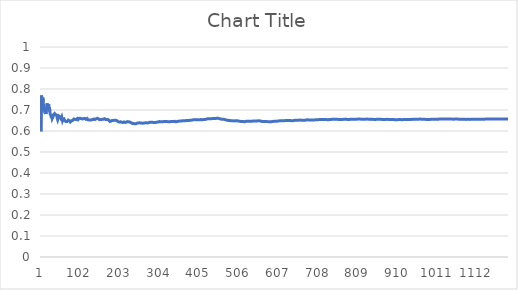
| Category | Series 0 |
|---|---|
| 0 | 0.597 |
| 1 | 0.769 |
| 2 | 0.72 |
| 3 | 0.7 |
| 4 | 0.758 |
| 5 | 0.738 |
| 6 | 0.738 |
| 7 | 0.707 |
| 8 | 0.706 |
| 9 | 0.711 |
| 10 | 0.684 |
| 11 | 0.692 |
| 12 | 0.681 |
| 13 | 0.701 |
| 14 | 0.717 |
| 15 | 0.731 |
| 16 | 0.719 |
| 17 | 0.711 |
| 18 | 0.722 |
| 19 | 0.727 |
| 20 | 0.702 |
| 21 | 0.713 |
| 22 | 0.692 |
| 23 | 0.681 |
| 24 | 0.685 |
| 25 | 0.671 |
| 26 | 0.662 |
| 27 | 0.67 |
| 28 | 0.659 |
| 29 | 0.66 |
| 30 | 0.667 |
| 31 | 0.676 |
| 32 | 0.674 |
| 33 | 0.675 |
| 34 | 0.683 |
| 35 | 0.683 |
| 36 | 0.678 |
| 37 | 0.677 |
| 38 | 0.678 |
| 39 | 0.676 |
| 40 | 0.667 |
| 41 | 0.665 |
| 42 | 0.654 |
| 43 | 0.658 |
| 44 | 0.665 |
| 45 | 0.671 |
| 46 | 0.673 |
| 47 | 0.673 |
| 48 | 0.667 |
| 49 | 0.666 |
| 50 | 0.66 |
| 51 | 0.663 |
| 52 | 0.668 |
| 53 | 0.659 |
| 54 | 0.651 |
| 55 | 0.656 |
| 56 | 0.653 |
| 57 | 0.654 |
| 58 | 0.658 |
| 59 | 0.657 |
| 60 | 0.648 |
| 61 | 0.648 |
| 62 | 0.648 |
| 63 | 0.646 |
| 64 | 0.644 |
| 65 | 0.644 |
| 66 | 0.645 |
| 67 | 0.644 |
| 68 | 0.648 |
| 69 | 0.652 |
| 70 | 0.657 |
| 71 | 0.653 |
| 72 | 0.648 |
| 73 | 0.645 |
| 74 | 0.643 |
| 75 | 0.645 |
| 76 | 0.645 |
| 77 | 0.649 |
| 78 | 0.65 |
| 79 | 0.647 |
| 80 | 0.65 |
| 81 | 0.649 |
| 82 | 0.653 |
| 83 | 0.657 |
| 84 | 0.653 |
| 85 | 0.655 |
| 86 | 0.655 |
| 87 | 0.656 |
| 88 | 0.653 |
| 89 | 0.654 |
| 90 | 0.657 |
| 91 | 0.657 |
| 92 | 0.659 |
| 93 | 0.66 |
| 94 | 0.655 |
| 95 | 0.656 |
| 96 | 0.66 |
| 97 | 0.663 |
| 98 | 0.663 |
| 99 | 0.661 |
| 100 | 0.661 |
| 101 | 0.658 |
| 102 | 0.659 |
| 103 | 0.658 |
| 104 | 0.66 |
| 105 | 0.657 |
| 106 | 0.657 |
| 107 | 0.659 |
| 108 | 0.659 |
| 109 | 0.662 |
| 110 | 0.659 |
| 111 | 0.66 |
| 112 | 0.659 |
| 113 | 0.66 |
| 114 | 0.656 |
| 115 | 0.657 |
| 116 | 0.657 |
| 117 | 0.659 |
| 118 | 0.656 |
| 119 | 0.653 |
| 120 | 0.656 |
| 121 | 0.657 |
| 122 | 0.653 |
| 123 | 0.653 |
| 124 | 0.652 |
| 125 | 0.652 |
| 126 | 0.654 |
| 127 | 0.652 |
| 128 | 0.653 |
| 129 | 0.654 |
| 130 | 0.654 |
| 131 | 0.654 |
| 132 | 0.655 |
| 133 | 0.656 |
| 134 | 0.657 |
| 135 | 0.659 |
| 136 | 0.658 |
| 137 | 0.655 |
| 138 | 0.654 |
| 139 | 0.656 |
| 140 | 0.658 |
| 141 | 0.66 |
| 142 | 0.659 |
| 143 | 0.66 |
| 144 | 0.659 |
| 145 | 0.656 |
| 146 | 0.657 |
| 147 | 0.656 |
| 148 | 0.653 |
| 149 | 0.654 |
| 150 | 0.652 |
| 151 | 0.654 |
| 152 | 0.655 |
| 153 | 0.656 |
| 154 | 0.657 |
| 155 | 0.656 |
| 156 | 0.656 |
| 157 | 0.657 |
| 158 | 0.656 |
| 159 | 0.657 |
| 160 | 0.657 |
| 161 | 0.659 |
| 162 | 0.656 |
| 163 | 0.655 |
| 164 | 0.655 |
| 165 | 0.655 |
| 166 | 0.653 |
| 167 | 0.654 |
| 168 | 0.654 |
| 169 | 0.655 |
| 170 | 0.654 |
| 171 | 0.652 |
| 172 | 0.651 |
| 173 | 0.65 |
| 174 | 0.648 |
| 175 | 0.645 |
| 176 | 0.647 |
| 177 | 0.646 |
| 178 | 0.647 |
| 179 | 0.647 |
| 180 | 0.649 |
| 181 | 0.65 |
| 182 | 0.652 |
| 183 | 0.652 |
| 184 | 0.65 |
| 185 | 0.65 |
| 186 | 0.651 |
| 187 | 0.652 |
| 188 | 0.653 |
| 189 | 0.653 |
| 190 | 0.651 |
| 191 | 0.649 |
| 192 | 0.65 |
| 193 | 0.648 |
| 194 | 0.648 |
| 195 | 0.645 |
| 196 | 0.644 |
| 197 | 0.644 |
| 198 | 0.643 |
| 199 | 0.642 |
| 200 | 0.643 |
| 201 | 0.643 |
| 202 | 0.644 |
| 203 | 0.642 |
| 204 | 0.643 |
| 205 | 0.642 |
| 206 | 0.643 |
| 207 | 0.643 |
| 208 | 0.641 |
| 209 | 0.641 |
| 210 | 0.643 |
| 211 | 0.643 |
| 212 | 0.641 |
| 213 | 0.642 |
| 214 | 0.641 |
| 215 | 0.64 |
| 216 | 0.641 |
| 217 | 0.643 |
| 218 | 0.644 |
| 219 | 0.644 |
| 220 | 0.645 |
| 221 | 0.644 |
| 222 | 0.645 |
| 223 | 0.644 |
| 224 | 0.644 |
| 225 | 0.643 |
| 226 | 0.642 |
| 227 | 0.642 |
| 228 | 0.64 |
| 229 | 0.639 |
| 230 | 0.637 |
| 231 | 0.638 |
| 232 | 0.636 |
| 233 | 0.635 |
| 234 | 0.635 |
| 235 | 0.636 |
| 236 | 0.636 |
| 237 | 0.637 |
| 238 | 0.634 |
| 239 | 0.634 |
| 240 | 0.633 |
| 241 | 0.634 |
| 242 | 0.635 |
| 243 | 0.636 |
| 244 | 0.637 |
| 245 | 0.638 |
| 246 | 0.638 |
| 247 | 0.638 |
| 248 | 0.637 |
| 249 | 0.639 |
| 250 | 0.639 |
| 251 | 0.638 |
| 252 | 0.638 |
| 253 | 0.638 |
| 254 | 0.637 |
| 255 | 0.638 |
| 256 | 0.638 |
| 257 | 0.638 |
| 258 | 0.637 |
| 259 | 0.637 |
| 260 | 0.637 |
| 261 | 0.637 |
| 262 | 0.638 |
| 263 | 0.639 |
| 264 | 0.639 |
| 265 | 0.639 |
| 266 | 0.638 |
| 267 | 0.639 |
| 268 | 0.639 |
| 269 | 0.638 |
| 270 | 0.637 |
| 271 | 0.638 |
| 272 | 0.638 |
| 273 | 0.639 |
| 274 | 0.64 |
| 275 | 0.641 |
| 276 | 0.642 |
| 277 | 0.642 |
| 278 | 0.643 |
| 279 | 0.642 |
| 280 | 0.642 |
| 281 | 0.642 |
| 282 | 0.643 |
| 283 | 0.641 |
| 284 | 0.641 |
| 285 | 0.64 |
| 286 | 0.641 |
| 287 | 0.641 |
| 288 | 0.641 |
| 289 | 0.64 |
| 290 | 0.641 |
| 291 | 0.641 |
| 292 | 0.641 |
| 293 | 0.642 |
| 294 | 0.642 |
| 295 | 0.643 |
| 296 | 0.644 |
| 297 | 0.643 |
| 298 | 0.643 |
| 299 | 0.644 |
| 300 | 0.644 |
| 301 | 0.645 |
| 302 | 0.644 |
| 303 | 0.644 |
| 304 | 0.644 |
| 305 | 0.643 |
| 306 | 0.644 |
| 307 | 0.645 |
| 308 | 0.644 |
| 309 | 0.644 |
| 310 | 0.644 |
| 311 | 0.645 |
| 312 | 0.645 |
| 313 | 0.646 |
| 314 | 0.646 |
| 315 | 0.645 |
| 316 | 0.645 |
| 317 | 0.645 |
| 318 | 0.646 |
| 319 | 0.646 |
| 320 | 0.645 |
| 321 | 0.645 |
| 322 | 0.644 |
| 323 | 0.644 |
| 324 | 0.643 |
| 325 | 0.644 |
| 326 | 0.645 |
| 327 | 0.645 |
| 328 | 0.644 |
| 329 | 0.644 |
| 330 | 0.645 |
| 331 | 0.645 |
| 332 | 0.646 |
| 333 | 0.645 |
| 334 | 0.645 |
| 335 | 0.645 |
| 336 | 0.646 |
| 337 | 0.645 |
| 338 | 0.646 |
| 339 | 0.646 |
| 340 | 0.646 |
| 341 | 0.646 |
| 342 | 0.645 |
| 343 | 0.644 |
| 344 | 0.644 |
| 345 | 0.644 |
| 346 | 0.645 |
| 347 | 0.645 |
| 348 | 0.646 |
| 349 | 0.647 |
| 350 | 0.647 |
| 351 | 0.646 |
| 352 | 0.647 |
| 353 | 0.647 |
| 354 | 0.648 |
| 355 | 0.648 |
| 356 | 0.648 |
| 357 | 0.648 |
| 358 | 0.648 |
| 359 | 0.648 |
| 360 | 0.649 |
| 361 | 0.649 |
| 362 | 0.65 |
| 363 | 0.65 |
| 364 | 0.648 |
| 365 | 0.649 |
| 366 | 0.649 |
| 367 | 0.649 |
| 368 | 0.65 |
| 369 | 0.65 |
| 370 | 0.65 |
| 371 | 0.65 |
| 372 | 0.65 |
| 373 | 0.65 |
| 374 | 0.651 |
| 375 | 0.65 |
| 376 | 0.65 |
| 377 | 0.651 |
| 378 | 0.651 |
| 379 | 0.652 |
| 380 | 0.651 |
| 381 | 0.651 |
| 382 | 0.651 |
| 383 | 0.652 |
| 384 | 0.652 |
| 385 | 0.653 |
| 386 | 0.653 |
| 387 | 0.653 |
| 388 | 0.654 |
| 389 | 0.653 |
| 390 | 0.653 |
| 391 | 0.654 |
| 392 | 0.654 |
| 393 | 0.654 |
| 394 | 0.654 |
| 395 | 0.653 |
| 396 | 0.653 |
| 397 | 0.653 |
| 398 | 0.652 |
| 399 | 0.653 |
| 400 | 0.653 |
| 401 | 0.652 |
| 402 | 0.653 |
| 403 | 0.653 |
| 404 | 0.654 |
| 405 | 0.654 |
| 406 | 0.655 |
| 407 | 0.654 |
| 408 | 0.654 |
| 409 | 0.653 |
| 410 | 0.654 |
| 411 | 0.654 |
| 412 | 0.654 |
| 413 | 0.654 |
| 414 | 0.654 |
| 415 | 0.655 |
| 416 | 0.655 |
| 417 | 0.655 |
| 418 | 0.655 |
| 419 | 0.656 |
| 420 | 0.656 |
| 421 | 0.657 |
| 422 | 0.657 |
| 423 | 0.658 |
| 424 | 0.659 |
| 425 | 0.658 |
| 426 | 0.658 |
| 427 | 0.659 |
| 428 | 0.659 |
| 429 | 0.658 |
| 430 | 0.658 |
| 431 | 0.658 |
| 432 | 0.659 |
| 433 | 0.659 |
| 434 | 0.659 |
| 435 | 0.659 |
| 436 | 0.659 |
| 437 | 0.658 |
| 438 | 0.659 |
| 439 | 0.659 |
| 440 | 0.659 |
| 441 | 0.66 |
| 442 | 0.66 |
| 443 | 0.661 |
| 444 | 0.661 |
| 445 | 0.66 |
| 446 | 0.66 |
| 447 | 0.661 |
| 448 | 0.661 |
| 449 | 0.661 |
| 450 | 0.66 |
| 451 | 0.66 |
| 452 | 0.66 |
| 453 | 0.659 |
| 454 | 0.658 |
| 455 | 0.658 |
| 456 | 0.658 |
| 457 | 0.657 |
| 458 | 0.658 |
| 459 | 0.657 |
| 460 | 0.656 |
| 461 | 0.655 |
| 462 | 0.656 |
| 463 | 0.656 |
| 464 | 0.656 |
| 465 | 0.656 |
| 466 | 0.655 |
| 467 | 0.654 |
| 468 | 0.654 |
| 469 | 0.654 |
| 470 | 0.653 |
| 471 | 0.652 |
| 472 | 0.652 |
| 473 | 0.652 |
| 474 | 0.652 |
| 475 | 0.651 |
| 476 | 0.65 |
| 477 | 0.649 |
| 478 | 0.65 |
| 479 | 0.65 |
| 480 | 0.65 |
| 481 | 0.65 |
| 482 | 0.65 |
| 483 | 0.65 |
| 484 | 0.649 |
| 485 | 0.65 |
| 486 | 0.65 |
| 487 | 0.649 |
| 488 | 0.648 |
| 489 | 0.648 |
| 490 | 0.648 |
| 491 | 0.647 |
| 492 | 0.648 |
| 493 | 0.648 |
| 494 | 0.649 |
| 495 | 0.648 |
| 496 | 0.648 |
| 497 | 0.649 |
| 498 | 0.649 |
| 499 | 0.649 |
| 500 | 0.648 |
| 501 | 0.648 |
| 502 | 0.647 |
| 503 | 0.647 |
| 504 | 0.647 |
| 505 | 0.646 |
| 506 | 0.647 |
| 507 | 0.646 |
| 508 | 0.645 |
| 509 | 0.646 |
| 510 | 0.645 |
| 511 | 0.645 |
| 512 | 0.646 |
| 513 | 0.646 |
| 514 | 0.645 |
| 515 | 0.645 |
| 516 | 0.644 |
| 517 | 0.644 |
| 518 | 0.644 |
| 519 | 0.645 |
| 520 | 0.645 |
| 521 | 0.645 |
| 522 | 0.646 |
| 523 | 0.646 |
| 524 | 0.646 |
| 525 | 0.646 |
| 526 | 0.646 |
| 527 | 0.646 |
| 528 | 0.647 |
| 529 | 0.647 |
| 530 | 0.646 |
| 531 | 0.646 |
| 532 | 0.646 |
| 533 | 0.646 |
| 534 | 0.647 |
| 535 | 0.646 |
| 536 | 0.646 |
| 537 | 0.647 |
| 538 | 0.647 |
| 539 | 0.647 |
| 540 | 0.647 |
| 541 | 0.647 |
| 542 | 0.647 |
| 543 | 0.647 |
| 544 | 0.648 |
| 545 | 0.647 |
| 546 | 0.648 |
| 547 | 0.648 |
| 548 | 0.647 |
| 549 | 0.648 |
| 550 | 0.648 |
| 551 | 0.648 |
| 552 | 0.648 |
| 553 | 0.648 |
| 554 | 0.648 |
| 555 | 0.648 |
| 556 | 0.648 |
| 557 | 0.648 |
| 558 | 0.647 |
| 559 | 0.647 |
| 560 | 0.647 |
| 561 | 0.646 |
| 562 | 0.645 |
| 563 | 0.646 |
| 564 | 0.646 |
| 565 | 0.645 |
| 566 | 0.645 |
| 567 | 0.645 |
| 568 | 0.645 |
| 569 | 0.645 |
| 570 | 0.645 |
| 571 | 0.645 |
| 572 | 0.645 |
| 573 | 0.645 |
| 574 | 0.645 |
| 575 | 0.644 |
| 576 | 0.644 |
| 577 | 0.644 |
| 578 | 0.644 |
| 579 | 0.644 |
| 580 | 0.644 |
| 581 | 0.644 |
| 582 | 0.644 |
| 583 | 0.644 |
| 584 | 0.644 |
| 585 | 0.645 |
| 586 | 0.645 |
| 587 | 0.645 |
| 588 | 0.645 |
| 589 | 0.646 |
| 590 | 0.645 |
| 591 | 0.646 |
| 592 | 0.646 |
| 593 | 0.647 |
| 594 | 0.646 |
| 595 | 0.646 |
| 596 | 0.646 |
| 597 | 0.646 |
| 598 | 0.646 |
| 599 | 0.646 |
| 600 | 0.646 |
| 601 | 0.647 |
| 602 | 0.648 |
| 603 | 0.647 |
| 604 | 0.648 |
| 605 | 0.648 |
| 606 | 0.649 |
| 607 | 0.648 |
| 608 | 0.649 |
| 609 | 0.649 |
| 610 | 0.649 |
| 611 | 0.649 |
| 612 | 0.649 |
| 613 | 0.649 |
| 614 | 0.649 |
| 615 | 0.649 |
| 616 | 0.649 |
| 617 | 0.649 |
| 618 | 0.649 |
| 619 | 0.649 |
| 620 | 0.649 |
| 621 | 0.65 |
| 622 | 0.65 |
| 623 | 0.65 |
| 624 | 0.65 |
| 625 | 0.649 |
| 626 | 0.649 |
| 627 | 0.649 |
| 628 | 0.649 |
| 629 | 0.649 |
| 630 | 0.649 |
| 631 | 0.65 |
| 632 | 0.65 |
| 633 | 0.65 |
| 634 | 0.65 |
| 635 | 0.649 |
| 636 | 0.649 |
| 637 | 0.649 |
| 638 | 0.649 |
| 639 | 0.649 |
| 640 | 0.649 |
| 641 | 0.649 |
| 642 | 0.649 |
| 643 | 0.65 |
| 644 | 0.65 |
| 645 | 0.651 |
| 646 | 0.651 |
| 647 | 0.651 |
| 648 | 0.651 |
| 649 | 0.651 |
| 650 | 0.651 |
| 651 | 0.651 |
| 652 | 0.651 |
| 653 | 0.651 |
| 654 | 0.651 |
| 655 | 0.652 |
| 656 | 0.652 |
| 657 | 0.652 |
| 658 | 0.652 |
| 659 | 0.652 |
| 660 | 0.652 |
| 661 | 0.652 |
| 662 | 0.652 |
| 663 | 0.651 |
| 664 | 0.651 |
| 665 | 0.651 |
| 666 | 0.65 |
| 667 | 0.651 |
| 668 | 0.651 |
| 669 | 0.651 |
| 670 | 0.651 |
| 671 | 0.652 |
| 672 | 0.651 |
| 673 | 0.652 |
| 674 | 0.652 |
| 675 | 0.653 |
| 676 | 0.653 |
| 677 | 0.653 |
| 678 | 0.653 |
| 679 | 0.653 |
| 680 | 0.652 |
| 681 | 0.652 |
| 682 | 0.652 |
| 683 | 0.653 |
| 684 | 0.653 |
| 685 | 0.653 |
| 686 | 0.653 |
| 687 | 0.653 |
| 688 | 0.653 |
| 689 | 0.652 |
| 690 | 0.652 |
| 691 | 0.653 |
| 692 | 0.653 |
| 693 | 0.653 |
| 694 | 0.652 |
| 695 | 0.653 |
| 696 | 0.653 |
| 697 | 0.653 |
| 698 | 0.654 |
| 699 | 0.654 |
| 700 | 0.654 |
| 701 | 0.654 |
| 702 | 0.654 |
| 703 | 0.654 |
| 704 | 0.654 |
| 705 | 0.654 |
| 706 | 0.654 |
| 707 | 0.654 |
| 708 | 0.655 |
| 709 | 0.655 |
| 710 | 0.655 |
| 711 | 0.655 |
| 712 | 0.655 |
| 713 | 0.655 |
| 714 | 0.655 |
| 715 | 0.655 |
| 716 | 0.655 |
| 717 | 0.655 |
| 718 | 0.655 |
| 719 | 0.655 |
| 720 | 0.654 |
| 721 | 0.654 |
| 722 | 0.655 |
| 723 | 0.655 |
| 724 | 0.655 |
| 725 | 0.654 |
| 726 | 0.654 |
| 727 | 0.654 |
| 728 | 0.654 |
| 729 | 0.654 |
| 730 | 0.654 |
| 731 | 0.654 |
| 732 | 0.654 |
| 733 | 0.654 |
| 734 | 0.654 |
| 735 | 0.654 |
| 736 | 0.655 |
| 737 | 0.655 |
| 738 | 0.655 |
| 739 | 0.656 |
| 740 | 0.656 |
| 741 | 0.655 |
| 742 | 0.656 |
| 743 | 0.656 |
| 744 | 0.656 |
| 745 | 0.656 |
| 746 | 0.656 |
| 747 | 0.656 |
| 748 | 0.656 |
| 749 | 0.656 |
| 750 | 0.656 |
| 751 | 0.656 |
| 752 | 0.656 |
| 753 | 0.656 |
| 754 | 0.656 |
| 755 | 0.656 |
| 756 | 0.655 |
| 757 | 0.654 |
| 758 | 0.655 |
| 759 | 0.654 |
| 760 | 0.655 |
| 761 | 0.655 |
| 762 | 0.655 |
| 763 | 0.655 |
| 764 | 0.655 |
| 765 | 0.655 |
| 766 | 0.655 |
| 767 | 0.655 |
| 768 | 0.655 |
| 769 | 0.655 |
| 770 | 0.656 |
| 771 | 0.656 |
| 772 | 0.657 |
| 773 | 0.657 |
| 774 | 0.656 |
| 775 | 0.656 |
| 776 | 0.656 |
| 777 | 0.655 |
| 778 | 0.655 |
| 779 | 0.655 |
| 780 | 0.655 |
| 781 | 0.655 |
| 782 | 0.655 |
| 783 | 0.655 |
| 784 | 0.655 |
| 785 | 0.655 |
| 786 | 0.656 |
| 787 | 0.656 |
| 788 | 0.655 |
| 789 | 0.656 |
| 790 | 0.655 |
| 791 | 0.655 |
| 792 | 0.656 |
| 793 | 0.656 |
| 794 | 0.656 |
| 795 | 0.656 |
| 796 | 0.656 |
| 797 | 0.656 |
| 798 | 0.656 |
| 799 | 0.656 |
| 800 | 0.656 |
| 801 | 0.656 |
| 802 | 0.656 |
| 803 | 0.656 |
| 804 | 0.656 |
| 805 | 0.657 |
| 806 | 0.657 |
| 807 | 0.657 |
| 808 | 0.657 |
| 809 | 0.657 |
| 810 | 0.657 |
| 811 | 0.657 |
| 812 | 0.657 |
| 813 | 0.657 |
| 814 | 0.656 |
| 815 | 0.656 |
| 816 | 0.657 |
| 817 | 0.656 |
| 818 | 0.656 |
| 819 | 0.656 |
| 820 | 0.657 |
| 821 | 0.656 |
| 822 | 0.657 |
| 823 | 0.657 |
| 824 | 0.656 |
| 825 | 0.657 |
| 826 | 0.656 |
| 827 | 0.657 |
| 828 | 0.657 |
| 829 | 0.657 |
| 830 | 0.657 |
| 831 | 0.657 |
| 832 | 0.656 |
| 833 | 0.656 |
| 834 | 0.657 |
| 835 | 0.656 |
| 836 | 0.657 |
| 837 | 0.656 |
| 838 | 0.656 |
| 839 | 0.656 |
| 840 | 0.656 |
| 841 | 0.655 |
| 842 | 0.655 |
| 843 | 0.656 |
| 844 | 0.656 |
| 845 | 0.655 |
| 846 | 0.655 |
| 847 | 0.655 |
| 848 | 0.654 |
| 849 | 0.655 |
| 850 | 0.655 |
| 851 | 0.655 |
| 852 | 0.655 |
| 853 | 0.656 |
| 854 | 0.656 |
| 855 | 0.656 |
| 856 | 0.656 |
| 857 | 0.656 |
| 858 | 0.656 |
| 859 | 0.656 |
| 860 | 0.656 |
| 861 | 0.656 |
| 862 | 0.656 |
| 863 | 0.655 |
| 864 | 0.655 |
| 865 | 0.656 |
| 866 | 0.655 |
| 867 | 0.655 |
| 868 | 0.655 |
| 869 | 0.655 |
| 870 | 0.654 |
| 871 | 0.654 |
| 872 | 0.655 |
| 873 | 0.655 |
| 874 | 0.655 |
| 875 | 0.655 |
| 876 | 0.655 |
| 877 | 0.655 |
| 878 | 0.655 |
| 879 | 0.655 |
| 880 | 0.656 |
| 881 | 0.655 |
| 882 | 0.655 |
| 883 | 0.655 |
| 884 | 0.655 |
| 885 | 0.655 |
| 886 | 0.655 |
| 887 | 0.655 |
| 888 | 0.655 |
| 889 | 0.655 |
| 890 | 0.655 |
| 891 | 0.655 |
| 892 | 0.655 |
| 893 | 0.655 |
| 894 | 0.655 |
| 895 | 0.655 |
| 896 | 0.654 |
| 897 | 0.655 |
| 898 | 0.654 |
| 899 | 0.654 |
| 900 | 0.654 |
| 901 | 0.654 |
| 902 | 0.654 |
| 903 | 0.654 |
| 904 | 0.654 |
| 905 | 0.654 |
| 906 | 0.654 |
| 907 | 0.654 |
| 908 | 0.654 |
| 909 | 0.654 |
| 910 | 0.654 |
| 911 | 0.654 |
| 912 | 0.655 |
| 913 | 0.655 |
| 914 | 0.654 |
| 915 | 0.654 |
| 916 | 0.654 |
| 917 | 0.654 |
| 918 | 0.654 |
| 919 | 0.654 |
| 920 | 0.654 |
| 921 | 0.655 |
| 922 | 0.654 |
| 923 | 0.655 |
| 924 | 0.655 |
| 925 | 0.655 |
| 926 | 0.655 |
| 927 | 0.655 |
| 928 | 0.655 |
| 929 | 0.655 |
| 930 | 0.655 |
| 931 | 0.654 |
| 932 | 0.654 |
| 933 | 0.655 |
| 934 | 0.655 |
| 935 | 0.655 |
| 936 | 0.655 |
| 937 | 0.655 |
| 938 | 0.655 |
| 939 | 0.655 |
| 940 | 0.655 |
| 941 | 0.655 |
| 942 | 0.655 |
| 943 | 0.656 |
| 944 | 0.656 |
| 945 | 0.656 |
| 946 | 0.655 |
| 947 | 0.656 |
| 948 | 0.656 |
| 949 | 0.656 |
| 950 | 0.656 |
| 951 | 0.656 |
| 952 | 0.656 |
| 953 | 0.656 |
| 954 | 0.656 |
| 955 | 0.656 |
| 956 | 0.656 |
| 957 | 0.656 |
| 958 | 0.656 |
| 959 | 0.656 |
| 960 | 0.656 |
| 961 | 0.656 |
| 962 | 0.657 |
| 963 | 0.657 |
| 964 | 0.657 |
| 965 | 0.657 |
| 966 | 0.657 |
| 967 | 0.656 |
| 968 | 0.656 |
| 969 | 0.656 |
| 970 | 0.656 |
| 971 | 0.656 |
| 972 | 0.656 |
| 973 | 0.656 |
| 974 | 0.656 |
| 975 | 0.656 |
| 976 | 0.656 |
| 977 | 0.656 |
| 978 | 0.655 |
| 979 | 0.655 |
| 980 | 0.655 |
| 981 | 0.655 |
| 982 | 0.655 |
| 983 | 0.655 |
| 984 | 0.654 |
| 985 | 0.655 |
| 986 | 0.654 |
| 987 | 0.655 |
| 988 | 0.655 |
| 989 | 0.655 |
| 990 | 0.655 |
| 991 | 0.655 |
| 992 | 0.655 |
| 993 | 0.656 |
| 994 | 0.656 |
| 995 | 0.656 |
| 996 | 0.656 |
| 997 | 0.656 |
| 998 | 0.656 |
| 999 | 0.656 |
| 1000 | 0.656 |
| 1001 | 0.656 |
| 1002 | 0.657 |
| 1003 | 0.657 |
| 1004 | 0.657 |
| 1005 | 0.656 |
| 1006 | 0.656 |
| 1007 | 0.656 |
| 1008 | 0.656 |
| 1009 | 0.656 |
| 1010 | 0.656 |
| 1011 | 0.656 |
| 1012 | 0.657 |
| 1013 | 0.657 |
| 1014 | 0.657 |
| 1015 | 0.657 |
| 1016 | 0.657 |
| 1017 | 0.657 |
| 1018 | 0.657 |
| 1019 | 0.657 |
| 1020 | 0.657 |
| 1021 | 0.657 |
| 1022 | 0.657 |
| 1023 | 0.657 |
| 1024 | 0.657 |
| 1025 | 0.657 |
| 1026 | 0.657 |
| 1027 | 0.657 |
| 1028 | 0.657 |
| 1029 | 0.657 |
| 1030 | 0.657 |
| 1031 | 0.657 |
| 1032 | 0.657 |
| 1033 | 0.657 |
| 1034 | 0.657 |
| 1035 | 0.657 |
| 1036 | 0.658 |
| 1037 | 0.657 |
| 1038 | 0.657 |
| 1039 | 0.657 |
| 1040 | 0.657 |
| 1041 | 0.657 |
| 1042 | 0.657 |
| 1043 | 0.657 |
| 1044 | 0.657 |
| 1045 | 0.657 |
| 1046 | 0.657 |
| 1047 | 0.657 |
| 1048 | 0.656 |
| 1049 | 0.656 |
| 1050 | 0.656 |
| 1051 | 0.657 |
| 1052 | 0.657 |
| 1053 | 0.657 |
| 1054 | 0.657 |
| 1055 | 0.657 |
| 1056 | 0.657 |
| 1057 | 0.657 |
| 1058 | 0.657 |
| 1059 | 0.657 |
| 1060 | 0.657 |
| 1061 | 0.657 |
| 1062 | 0.656 |
| 1063 | 0.656 |
| 1064 | 0.656 |
| 1065 | 0.656 |
| 1066 | 0.656 |
| 1067 | 0.656 |
| 1068 | 0.656 |
| 1069 | 0.656 |
| 1070 | 0.656 |
| 1071 | 0.655 |
| 1072 | 0.656 |
| 1073 | 0.656 |
| 1074 | 0.656 |
| 1075 | 0.656 |
| 1076 | 0.656 |
| 1077 | 0.656 |
| 1078 | 0.656 |
| 1079 | 0.656 |
| 1080 | 0.655 |
| 1081 | 0.655 |
| 1082 | 0.655 |
| 1083 | 0.655 |
| 1084 | 0.656 |
| 1085 | 0.656 |
| 1086 | 0.655 |
| 1087 | 0.655 |
| 1088 | 0.655 |
| 1089 | 0.655 |
| 1090 | 0.655 |
| 1091 | 0.655 |
| 1092 | 0.655 |
| 1093 | 0.656 |
| 1094 | 0.656 |
| 1095 | 0.656 |
| 1096 | 0.656 |
| 1097 | 0.656 |
| 1098 | 0.656 |
| 1099 | 0.655 |
| 1100 | 0.655 |
| 1101 | 0.655 |
| 1102 | 0.656 |
| 1103 | 0.655 |
| 1104 | 0.656 |
| 1105 | 0.656 |
| 1106 | 0.656 |
| 1107 | 0.656 |
| 1108 | 0.656 |
| 1109 | 0.656 |
| 1110 | 0.656 |
| 1111 | 0.656 |
| 1112 | 0.656 |
| 1113 | 0.656 |
| 1114 | 0.656 |
| 1115 | 0.656 |
| 1116 | 0.656 |
| 1117 | 0.656 |
| 1118 | 0.656 |
| 1119 | 0.656 |
| 1120 | 0.656 |
| 1121 | 0.656 |
| 1122 | 0.656 |
| 1123 | 0.657 |
| 1124 | 0.657 |
| 1125 | 0.656 |
| 1126 | 0.656 |
| 1127 | 0.656 |
| 1128 | 0.656 |
| 1129 | 0.656 |
| 1130 | 0.657 |
| 1131 | 0.657 |
| 1132 | 0.657 |
| 1133 | 0.657 |
| 1134 | 0.657 |
| 1135 | 0.657 |
| 1136 | 0.657 |
| 1137 | 0.657 |
| 1138 | 0.657 |
| 1139 | 0.657 |
| 1140 | 0.657 |
| 1141 | 0.657 |
| 1142 | 0.657 |
| 1143 | 0.657 |
| 1144 | 0.657 |
| 1145 | 0.657 |
| 1146 | 0.658 |
| 1147 | 0.657 |
| 1148 | 0.658 |
| 1149 | 0.657 |
| 1150 | 0.657 |
| 1151 | 0.658 |
| 1152 | 0.658 |
| 1153 | 0.657 |
| 1154 | 0.657 |
| 1155 | 0.657 |
| 1156 | 0.657 |
| 1157 | 0.657 |
| 1158 | 0.657 |
| 1159 | 0.657 |
| 1160 | 0.657 |
| 1161 | 0.657 |
| 1162 | 0.657 |
| 1163 | 0.657 |
| 1164 | 0.657 |
| 1165 | 0.657 |
| 1166 | 0.657 |
| 1167 | 0.657 |
| 1168 | 0.657 |
| 1169 | 0.657 |
| 1170 | 0.657 |
| 1171 | 0.657 |
| 1172 | 0.656 |
| 1173 | 0.656 |
| 1174 | 0.657 |
| 1175 | 0.657 |
| 1176 | 0.657 |
| 1177 | 0.657 |
| 1178 | 0.657 |
| 1179 | 0.657 |
| 1180 | 0.657 |
| 1181 | 0.657 |
| 1182 | 0.657 |
| 1183 | 0.657 |
| 1184 | 0.657 |
| 1185 | 0.657 |
| 1186 | 0.657 |
| 1187 | 0.657 |
| 1188 | 0.657 |
| 1189 | 0.657 |
| 1190 | 0.657 |